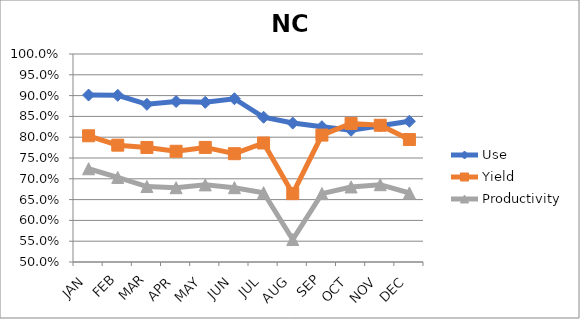
| Category | Use | Yield | Productivity |
|---|---|---|---|
| JAN | 0.901 | 0.803 | 0.724 |
| FEB | 0.901 | 0.781 | 0.703 |
| MAR | 0.879 | 0.775 | 0.681 |
| APR | 0.886 | 0.766 | 0.679 |
| MAY | 0.884 | 0.775 | 0.685 |
| JUN | 0.892 | 0.76 | 0.679 |
| JUL | 0.848 | 0.786 | 0.667 |
| AUG | 0.834 | 0.664 | 0.554 |
| SEP | 0.825 | 0.805 | 0.664 |
| OCT | 0.817 | 0.833 | 0.68 |
| NOV | 0.828 | 0.829 | 0.686 |
| DEC | 0.838 | 0.794 | 0.666 |